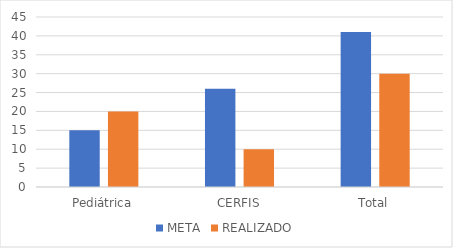
| Category | META | REALIZADO |
|---|---|---|
| Pediátrica | 15 | 20 |
| CERFIS | 26 | 10 |
| Total | 41 | 30 |